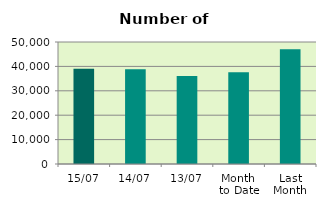
| Category | Series 0 |
|---|---|
| 15/07 | 39052 |
| 14/07 | 38828 |
| 13/07 | 36030 |
| Month 
to Date | 37586.909 |
| Last
Month | 46980.273 |